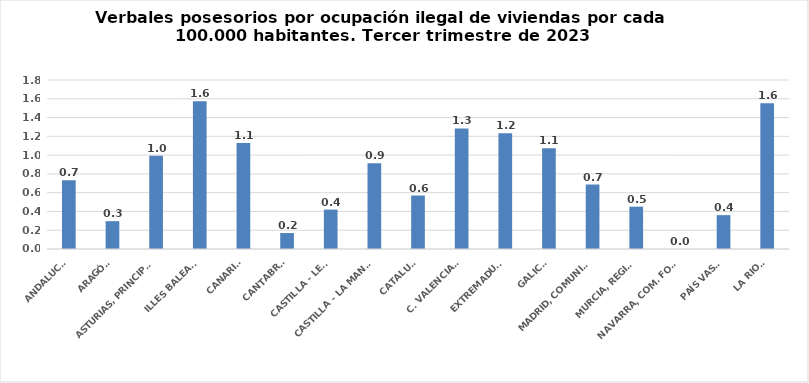
| Category | Series 0 |
|---|---|
| ANDALUCÍA | 0.732 |
| ARAGÓN | 0.296 |
| ASTURIAS, PRINCIPADO | 0.993 |
| ILLES BALEARS | 1.575 |
| CANARIAS | 1.13 |
| CANTABRIA | 0.17 |
| CASTILLA - LEÓN | 0.42 |
| CASTILLA - LA MANCHA | 0.913 |
| CATALUÑA | 0.57 |
| C. VALENCIANA | 1.284 |
| EXTREMADURA | 1.233 |
| GALICIA | 1.074 |
| MADRID, COMUNIDAD | 0.686 |
| MURCIA, REGIÓN | 0.451 |
| NAVARRA, COM. FORAL | 0 |
| PAÍS VASCO | 0.36 |
| LA RIOJA | 1.552 |